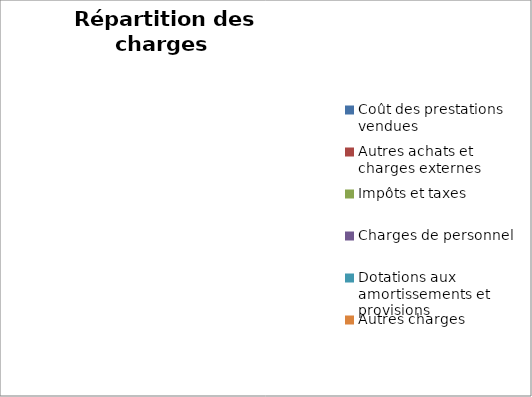
| Category | 2021 |
|---|---|
| Coût des prestations vendues | 0 |
| Autres achats et charges externes | 0 |
| Impôts et taxes | 0 |
| Charges de personnel | 0 |
| Dotations aux amortissements et provisions | 0 |
| Autres charges | 0 |